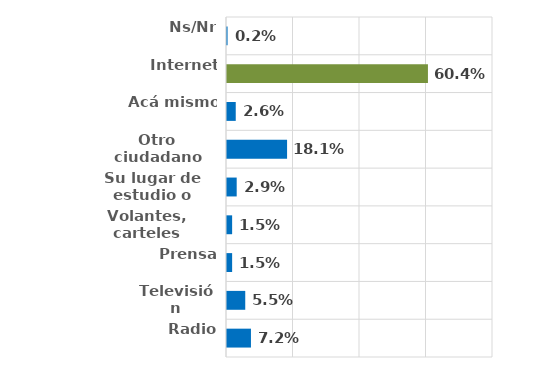
| Category | Series 0 |
|---|---|
| Radio | 0.072 |
| Televisión | 0.055 |
| Prensa | 0.015 |
| Volantes, carteles | 0.015 |
| Su lugar de estudio o trabajo | 0.029 |
| Otro ciudadano | 0.181 |
| Acá mismo | 0.026 |
| Internet | 0.604 |
| Ns/Nr | 0.002 |